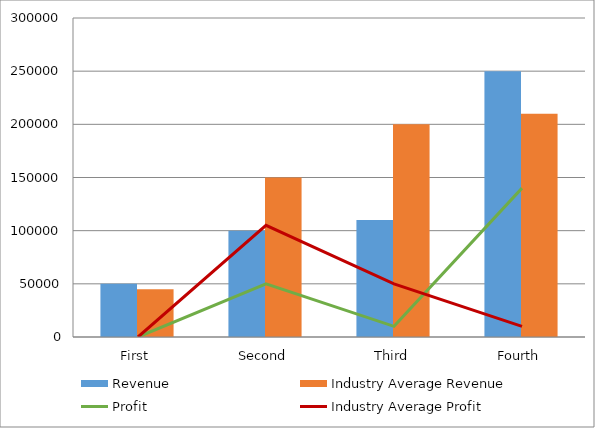
| Category | Revenue | Industry Average Revenue |
|---|---|---|
| First | 50000 | 45000 |
| Second | 100000 | 150000 |
| Third | 110000 | 200000 |
| Fourth | 250000 | 210000 |